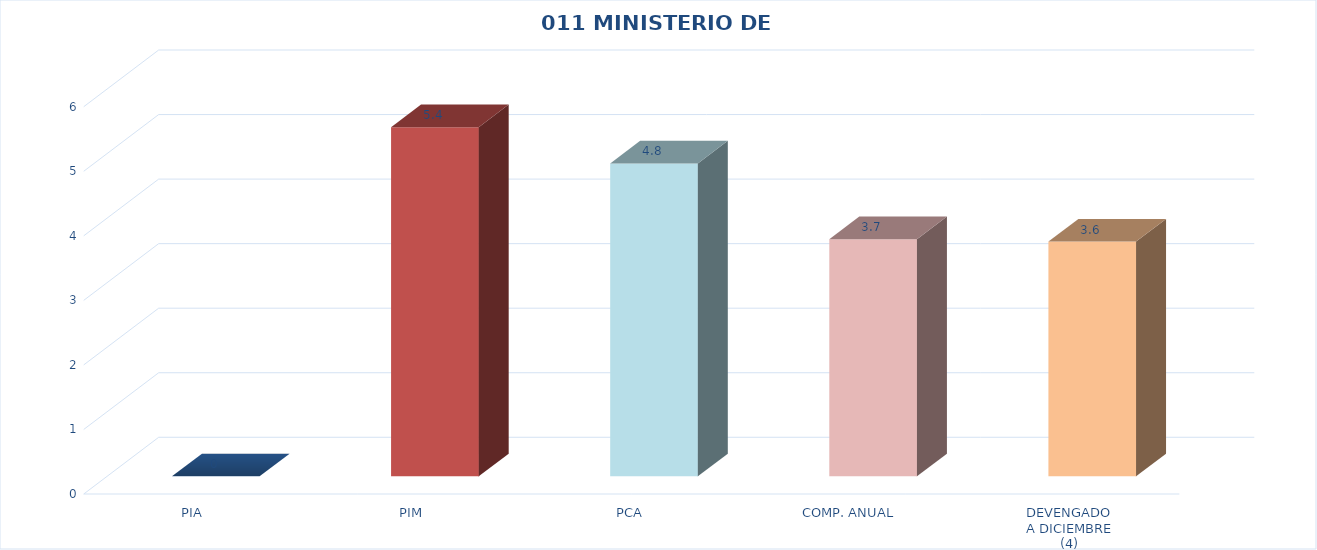
| Category | 011 MINISTERIO DE SALUD |
|---|---|
| PIA | 0 |
| PIM | 5.408 |
| PCA | 4.848 |
| COMP. ANUAL | 3.673 |
| DEVENGADO
A DICIEMBRE
(4) | 3.637 |